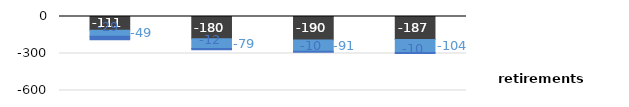
| Category | 7_coal | 8_oil and natural gas | 9_nuclear |
|---|---|---|---|
| ref2021 | -111.13 | -49.06 | -29.076 |
| c15 | -179.948 | -78.823 | -11.678 |
| c25 | -189.962 | -91.16 | -9.518 |
| c35 | -187.021 | -104.43 | -9.518 |